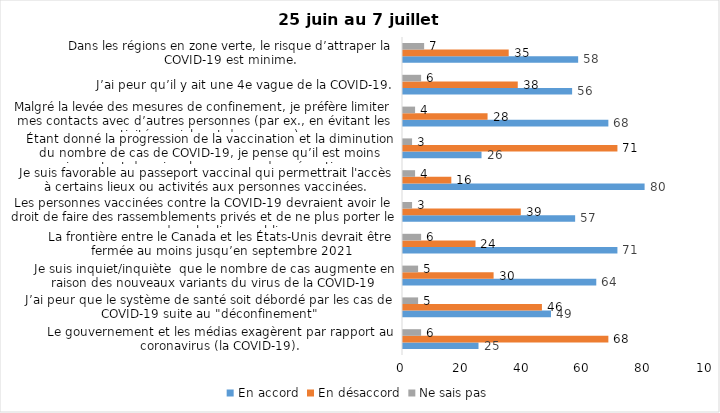
| Category | En accord | En désaccord | Ne sais pas |
|---|---|---|---|
| Le gouvernement et les médias exagèrent par rapport au coronavirus (la COVID-19). | 25 | 68 | 6 |
| J’ai peur que le système de santé soit débordé par les cas de COVID-19 suite au "déconfinement" | 49 | 46 | 5 |
| Je suis inquiet/inquiète  que le nombre de cas augmente en raison des nouveaux variants du virus de la COVID-19 | 64 | 30 | 5 |
| La frontière entre le Canada et les États-Unis devrait être fermée au moins jusqu’en septembre 2021 | 71 | 24 | 6 |
| Les personnes vaccinées contre la COVID-19 devraient avoir le droit de faire des rassemblements privés et de ne plus porter le masque dans les lieux publics. | 57 | 39 | 3 |
| Je suis favorable au passeport vaccinal qui permettrait l'accès à certains lieux ou activités aux personnes vaccinées. | 80 | 16 | 4 |
| Étant donné la progression de la vaccination et la diminution du nombre de cas de COVID-19, je pense qu’il est moins important de suivre les mesures de prévention. | 26 | 71 | 3 |
| Malgré la levée des mesures de confinement, je préfère limiter mes contacts avec d’autres personnes (par ex., en évitant les activités sociales et de groupes) | 68 | 28 | 4 |
| J’ai peur qu’il y ait une 4e vague de la COVID-19. | 56 | 38 | 6 |
| Dans les régions en zone verte, le risque d’attraper la COVID-19 est minime. | 58 | 35 | 7 |